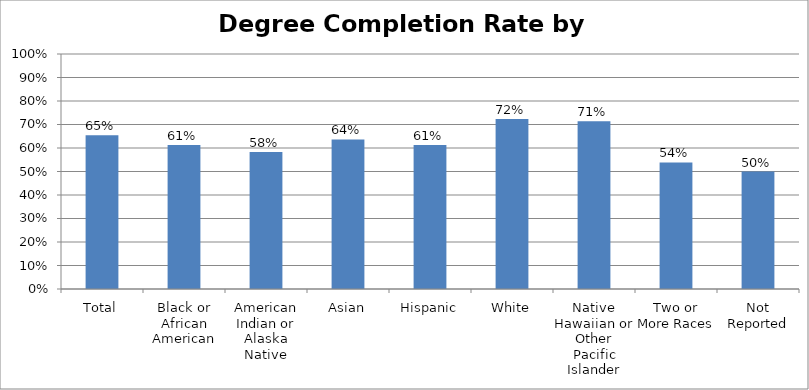
| Category | Certificate Completion Rate by Race/Ethnicity |
|---|---|
| Total | 0.655 |
| Black or African American | 0.613 |
| American Indian or Alaska Native | 0.583 |
| Asian | 0.636 |
| Hispanic | 0.613 |
| White | 0.723 |
| Native Hawaiian or Other Pacific Islander | 0.714 |
| Two or More Races | 0.538 |
| Not Reported | 0.5 |